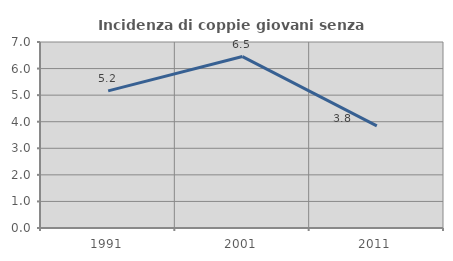
| Category | Incidenza di coppie giovani senza figli |
|---|---|
| 1991.0 | 5.161 |
| 2001.0 | 6.452 |
| 2011.0 | 3.846 |